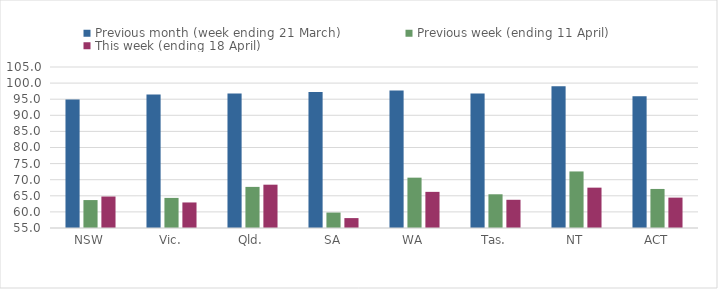
| Category | Previous month (week ending 21 March) | Previous week (ending 11 April) | This week (ending 18 April) |
|---|---|---|---|
| NSW | 94.902 | 63.674 | 64.774 |
| Vic. | 96.481 | 64.345 | 62.931 |
| Qld. | 96.806 | 67.768 | 68.452 |
| SA | 97.265 | 59.796 | 58.076 |
| WA | 97.705 | 70.634 | 66.224 |
| Tas. | 96.743 | 65.474 | 63.763 |
| NT | 99.027 | 72.561 | 67.533 |
| ACT | 95.905 | 67.129 | 64.435 |